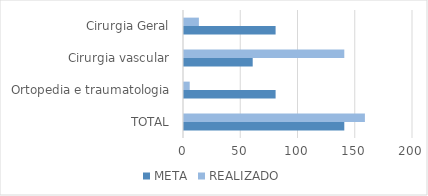
| Category | META | REALIZADO |
|---|---|---|
| TOTAL | 140 | 158 |
| Ortopedia e traumatologia | 80 | 5 |
| Cirurgia vascular | 60 | 140 |
| Cirurgia Geral | 80 | 13 |